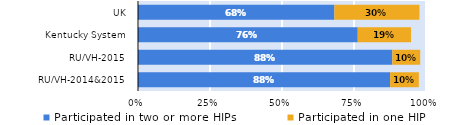
| Category | Participated in two or more HIPs | Participated in one HIP |
|---|---|---|
| RU/VH-2014&2015 | 0.875 | 0.1 |
| RU/VH-2015 | 0.883 | 0.097 |
| Kentucky System | 0.763 | 0.185 |
| UK | 0.682 | 0.295 |